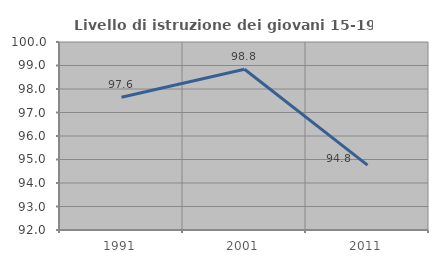
| Category | Livello di istruzione dei giovani 15-19 anni |
|---|---|
| 1991.0 | 97.65 |
| 2001.0 | 98.839 |
| 2011.0 | 94.76 |